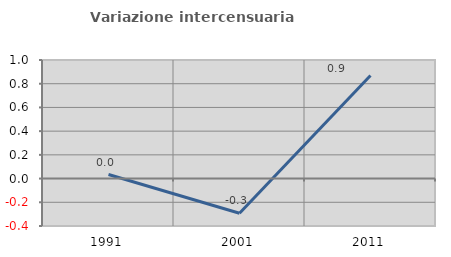
| Category | Variazione intercensuaria annua |
|---|---|
| 1991.0 | 0.034 |
| 2001.0 | -0.292 |
| 2011.0 | 0.869 |